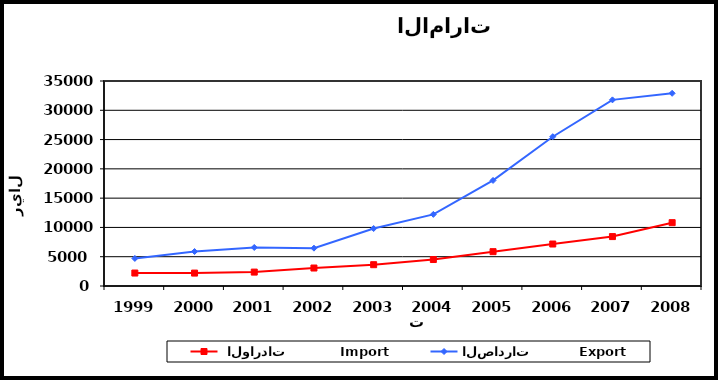
| Category |  الواردات           Import | الصادرات          Export |
|---|---|---|
| 1999.0 | 2213 | 4710 |
| 2000.0 | 2206 | 5886 |
| 2001.0 | 2375 | 6576 |
| 2002.0 | 3068 | 6460 |
| 2003.0 | 3637 | 9812 |
| 2004.0 | 4520 | 12230 |
| 2005.0 | 5862 | 18027 |
| 2006.0 | 7167 | 25488 |
| 2007.0 | 8437 | 31780 |
| 2008.0 | 10814 | 32900 |